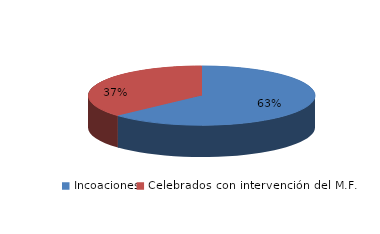
| Category | Series 0 |
|---|---|
| Incoaciones | 2933 |
| Celebrados con intervención del M.F. | 1710 |